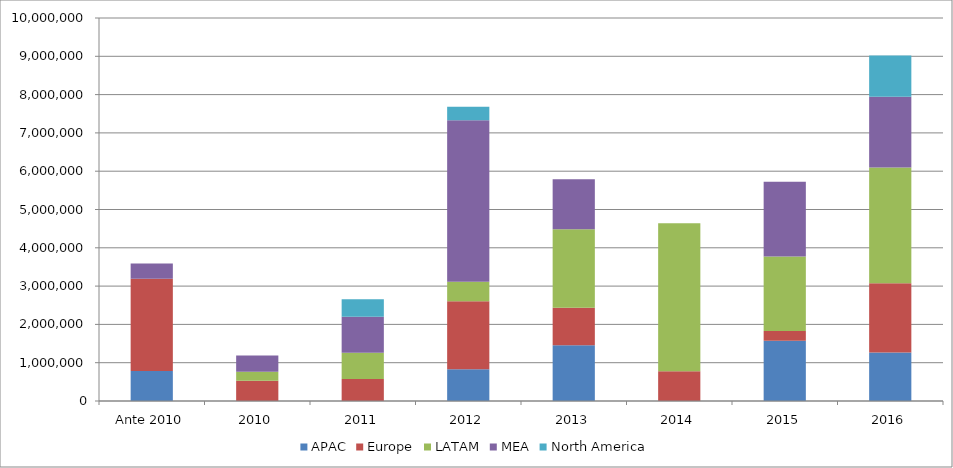
| Category | APAC | Europe | LATAM | MEA | North America |
|---|---|---|---|---|---|
| Ante 2010 | 786000 | 2406750 | 0 | 400000 | 0 |
| 2010 | 0 | 525800 | 240000 | 425000 | 0 |
| 2011 | 0 | 576800 | 680000 | 945000 | 458000 |
| 2012 | 831000 | 1773000 | 510000 | 4216500 | 350000 |
| 2013 | 1456482 | 975000 | 2050218 | 1309200 | 0 |
| 2014 | 0 | 776500 | 3866850 | 0 | 0 |
| 2015 | 1575029 | 250000 | 1950000 | 1947697 | 0 |
| 2016 | 1267775.808 | 1806399.644 | 3022580.903 | 1848679.333 | 1077332.84 |